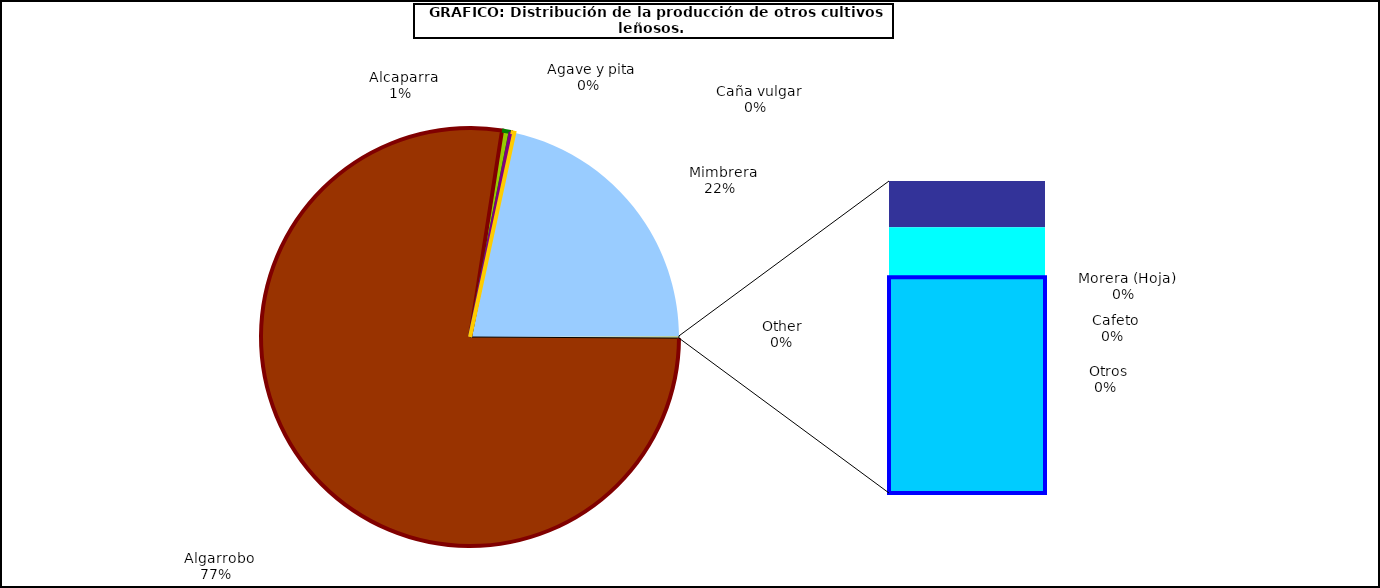
| Category | Series 0 |
|---|---|
|   Algarrobo | 36894 |
|   Alcaparra | 313 |
|   Agave y pita | 8 |
|   Caña vulgar | 132 |
|   Mimbrera | 10261 |
|   Cafeto | 12 |
|   Morera (Hoja) | 13 |
|   Otros | 56 |